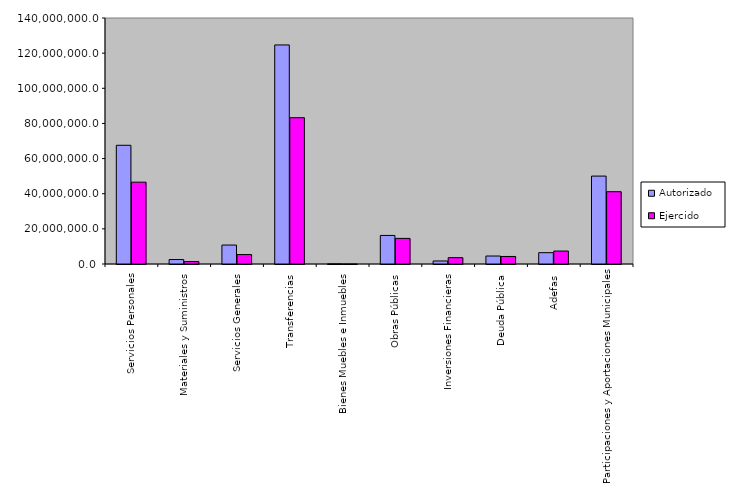
| Category | Autorizado | Ejercido |
|---|---|---|
| 0 | 67555296.6 | 46576861.1 |
| 1 | 2531108.6 | 1372268.5 |
| 2 | 10779101.4 | 5370189.4 |
| 3 | 124668846.9 | 83250043.9 |
| 4 | 85214.2 | 2192.5 |
| 5 | 16247297.2 | 14573253.1 |
| 6 | 1722832 | 3605081.8 |
| 7 | 4541774.766 | 4282122.6 |
| 8 | 6442504.4 | 7362956.8 |
| 9 | 50035957.4 | 41139610.3 |